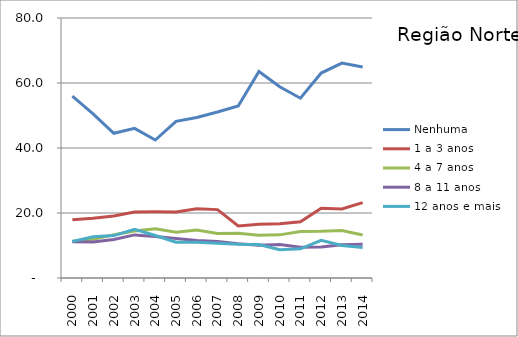
| Category | Nenhuma | 1 a 3 anos | 4 a 7 anos | 8 a 11 anos | 12 anos e mais |
|---|---|---|---|---|---|
| 2000.0 | 55.986 | 17.919 | 11.328 | 11.15 | 11.275 |
| 2001.0 | 50.488 | 18.408 | 11.881 | 11.051 | 12.719 |
| 2002.0 | 44.527 | 19.083 | 13.286 | 11.842 | 13.041 |
| 2003.0 | 46.028 | 20.305 | 14.431 | 13.264 | 14.986 |
| 2004.0 | 42.453 | 20.381 | 15.157 | 12.767 | 13.067 |
| 2005.0 | 48.199 | 20.322 | 14.074 | 12.179 | 11.02 |
| 2006.0 | 49.401 | 21.312 | 14.793 | 11.575 | 11.025 |
| 2007.0 | 51.074 | 21.043 | 13.726 | 11.25 | 10.672 |
| 2008.0 | 52.922 | 16.038 | 13.797 | 10.552 | 10.353 |
| 2009.0 | 63.525 | 16.523 | 13.157 | 10.1 | 10.298 |
| 2010.0 | 58.846 | 16.702 | 13.274 | 10.299 | 8.703 |
| 2011.0 | 55.323 | 17.307 | 14.318 | 9.463 | 8.964 |
| 2012.0 | 63.052 | 21.447 | 14.363 | 9.565 | 11.59 |
| 2013.0 | 66.116 | 21.247 | 14.587 | 10.216 | 10.008 |
| 2014.0 | 64.911 | 23.184 | 13.245 | 10.378 | 9.418 |